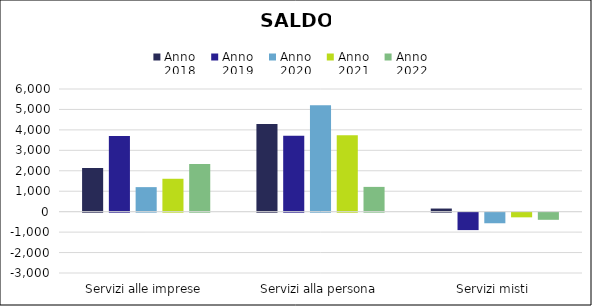
| Category | Anno
2018 | Anno
2019 | Anno
2020 | Anno
2021 | Anno
2022 |
|---|---|---|---|---|---|
| Servizi alle imprese | 2133 | 3707 | 1200 | 1609 | 2329 |
| Servizi alla persona | 4285 | 3709 | 5203 | 3737 | 1212 |
| Servizi misti | 153 | -853 | -518 | -228 | -349 |